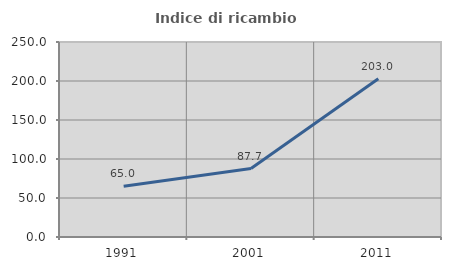
| Category | Indice di ricambio occupazionale  |
|---|---|
| 1991.0 | 65.032 |
| 2001.0 | 87.698 |
| 2011.0 | 202.995 |